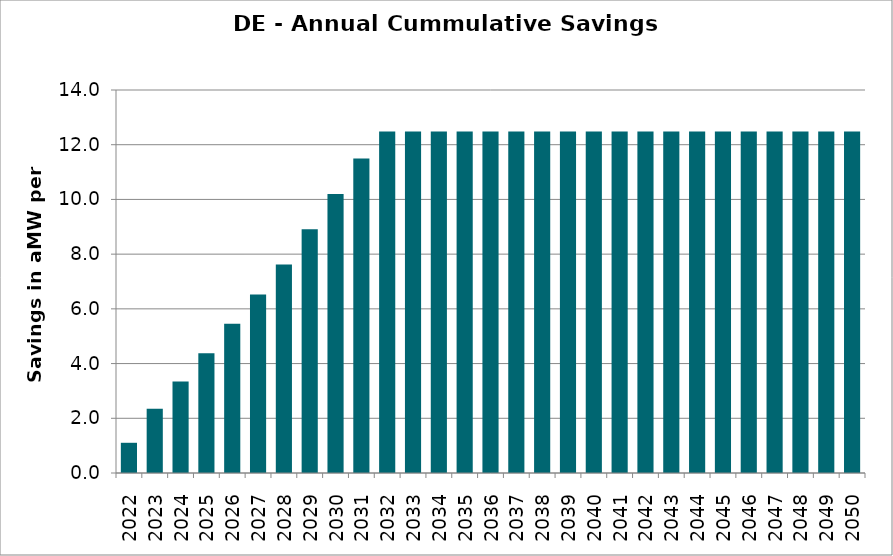
| Category | Annual Cummulative Savings (aMW) |
|---|---|
| 2022.0 | 1.104 |
| 2023.0 | 2.349 |
| 2024.0 | 3.346 |
| 2025.0 | 4.374 |
| 2026.0 | 5.451 |
| 2027.0 | 6.528 |
| 2028.0 | 7.622 |
| 2029.0 | 8.912 |
| 2030.0 | 10.202 |
| 2031.0 | 11.492 |
| 2032.0 | 12.484 |
| 2033.0 | 12.484 |
| 2034.0 | 12.484 |
| 2035.0 | 12.484 |
| 2036.0 | 12.484 |
| 2037.0 | 12.484 |
| 2038.0 | 12.484 |
| 2039.0 | 12.484 |
| 2040.0 | 12.484 |
| 2041.0 | 12.484 |
| 2042.0 | 12.484 |
| 2043.0 | 12.484 |
| 2044.0 | 12.484 |
| 2045.0 | 12.484 |
| 2046.0 | 12.484 |
| 2047.0 | 12.484 |
| 2048.0 | 12.484 |
| 2049.0 | 12.484 |
| 2050.0 | 12.484 |